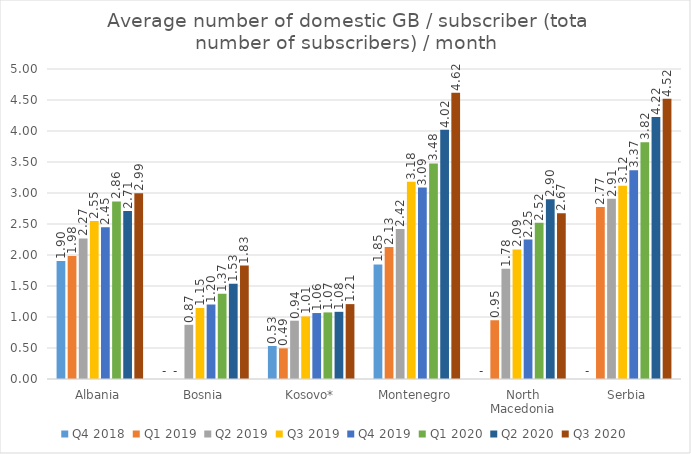
| Category | Q4 2018 | Q1 2019 | Q2 2019 | Q3 2019 | Q4 2019 | Q1 2020 | Q2 2020 | Q3 2020 |
|---|---|---|---|---|---|---|---|---|
| Albania | 1.904 | 1.984 | 2.267 | 2.549 | 2.449 | 2.863 | 2.709 | 2.995 |
| Bosnia | 0 | 0 | 0.874 | 1.145 | 1.202 | 1.374 | 1.535 | 1.83 |
| Kosovo* | 0.532 | 0.495 | 0.94 | 1.009 | 1.064 | 1.074 | 1.084 | 1.208 |
| Montenegro | 1.847 | 2.13 | 2.42 | 3.183 | 3.087 | 3.476 | 4.021 | 4.615 |
| North Macedonia | 0 | 0.948 | 1.778 | 2.089 | 2.25 | 2.519 | 2.897 | 2.673 |
| Serbia | 0 | 2.772 | 2.907 | 3.117 | 3.366 | 3.818 | 4.225 | 4.522 |